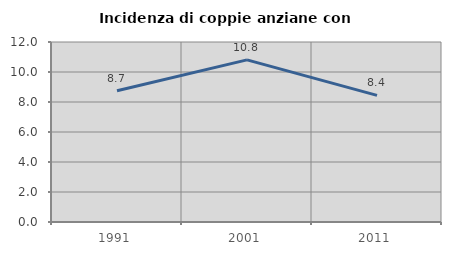
| Category | Incidenza di coppie anziane con figli |
|---|---|
| 1991.0 | 8.745 |
| 2001.0 | 10.811 |
| 2011.0 | 8.439 |